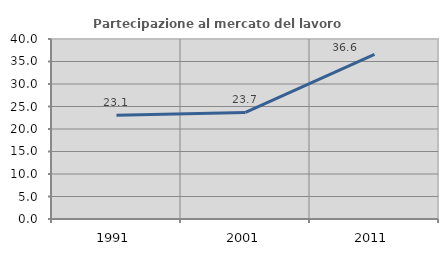
| Category | Partecipazione al mercato del lavoro  femminile |
|---|---|
| 1991.0 | 23.059 |
| 2001.0 | 23.69 |
| 2011.0 | 36.607 |